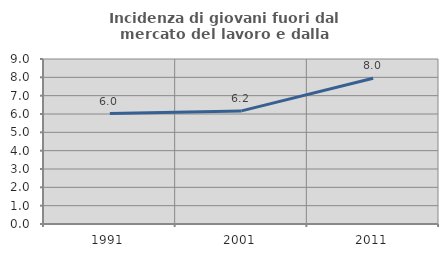
| Category | Incidenza di giovani fuori dal mercato del lavoro e dalla formazione  |
|---|---|
| 1991.0 | 6.027 |
| 2001.0 | 6.17 |
| 2011.0 | 7.953 |